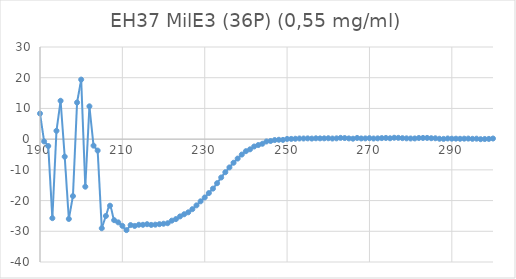
| Category | Series 0 |
|---|---|
| 300.0 | 0.206 |
| 299.0 | 0.076 |
| 298.0 | 0.043 |
| 297.0 | -0.016 |
| 296.0 | 0.15 |
| 295.0 | 0.103 |
| 294.0 | 0.184 |
| 293.0 | 0.155 |
| 292.0 | 0.12 |
| 291.0 | 0.155 |
| 290.0 | 0.147 |
| 289.0 | 0.214 |
| 288.0 | 0.087 |
| 287.0 | 0.132 |
| 286.0 | 0.283 |
| 285.0 | 0.302 |
| 284.0 | 0.399 |
| 283.0 | 0.389 |
| 282.0 | 0.374 |
| 281.0 | 0.227 |
| 280.0 | 0.219 |
| 279.0 | 0.26 |
| 278.0 | 0.32 |
| 277.0 | 0.423 |
| 276.0 | 0.453 |
| 275.0 | 0.281 |
| 274.0 | 0.386 |
| 273.0 | 0.339 |
| 272.0 | 0.259 |
| 271.0 | 0.207 |
| 270.0 | 0.313 |
| 269.0 | 0.243 |
| 268.0 | 0.226 |
| 267.0 | 0.388 |
| 266.0 | 0.147 |
| 265.0 | 0.236 |
| 264.0 | 0.353 |
| 263.0 | 0.415 |
| 262.0 | 0.26 |
| 261.0 | 0.201 |
| 260.0 | 0.292 |
| 259.0 | 0.259 |
| 258.0 | 0.249 |
| 257.0 | 0.274 |
| 256.0 | 0.187 |
| 255.0 | 0.248 |
| 254.0 | 0.21 |
| 253.0 | 0.212 |
| 252.0 | 0.128 |
| 251.0 | 0.08 |
| 250.0 | 0.066 |
| 249.0 | -0.244 |
| 248.0 | -0.203 |
| 247.0 | -0.301 |
| 246.0 | -0.605 |
| 245.0 | -0.756 |
| 244.0 | -1.505 |
| 243.0 | -1.922 |
| 242.0 | -2.4 |
| 241.0 | -3.315 |
| 240.0 | -3.923 |
| 239.0 | -5.018 |
| 238.0 | -6.323 |
| 237.0 | -7.682 |
| 236.0 | -9.205 |
| 235.0 | -10.77 |
| 234.0 | -12.485 |
| 233.0 | -14.35 |
| 232.0 | -16.109 |
| 231.0 | -17.567 |
| 230.0 | -18.989 |
| 229.0 | -20.245 |
| 228.0 | -21.558 |
| 227.0 | -22.793 |
| 226.0 | -23.822 |
| 225.0 | -24.455 |
| 224.0 | -25.16 |
| 223.0 | -26.033 |
| 222.0 | -26.538 |
| 221.0 | -27.376 |
| 220.0 | -27.535 |
| 219.0 | -27.688 |
| 218.0 | -27.842 |
| 217.0 | -27.922 |
| 216.0 | -27.695 |
| 215.0 | -27.887 |
| 214.0 | -27.879 |
| 213.0 | -28.255 |
| 212.0 | -27.978 |
| 211.0 | -29.614 |
| 210.0 | -28.229 |
| 209.0 | -27.092 |
| 208.0 | -26.38 |
| 207.0 | -21.669 |
| 206.0 | -25.019 |
| 205.0 | -29.008 |
| 204.0 | -3.721 |
| 203.0 | -2.116 |
| 202.0 | 10.686 |
| 201.0 | -15.48 |
| 200.0 | 19.391 |
| 199.0 | 11.929 |
| 198.0 | -18.531 |
| 197.0 | -25.987 |
| 196.0 | -5.703 |
| 195.0 | 12.49 |
| 194.0 | 2.713 |
| 193.0 | -25.727 |
| 192.0 | -2.244 |
| 191.0 | -0.748 |
| 190.0 | 8.34 |